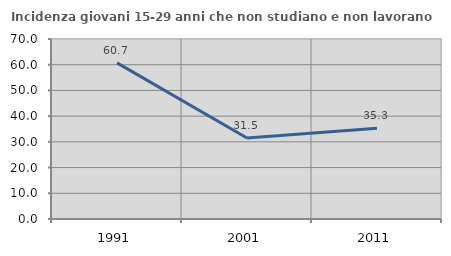
| Category | Incidenza giovani 15-29 anni che non studiano e non lavorano  |
|---|---|
| 1991.0 | 60.715 |
| 2001.0 | 31.518 |
| 2011.0 | 35.274 |